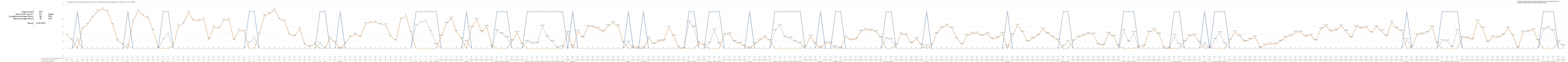
| Category | 1 = Strom reicht im Tagesdurchschnitt aus | Zusätzlich benötigter Strom | Überschüssiger Strom |
|---|---|---|---|
| 0 | 0 | 0.36 | 0 |
| 1 | 0 | 0.23 | 0 |
| 2 | 1 | 0 | 0.25 |
| 3 | 0 | 0.54 | 0 |
| 4 | 0 | 0.66 | 0 |
| 5 | 0 | 0.85 | 0 |
| 6 | 0 | 1.02 | 0 |
| 7 | 0 | 1.07 | 0 |
| 8 | 0 | 1.01 | 0 |
| 9 | 0 | 0.65 | 0 |
| 10 | 0 | 0.21 | 0 |
| 11 | 0 | 0.12 | 0 |
| 12 | 1 | 0 | 0.09 |
| 13 | 0 | 0.73 | 0 |
| 14 | 0 | 1.02 | 0 |
| 15 | 0 | 0.9 | 0 |
| 16 | 0 | 0.83 | 0 |
| 17 | 0 | 0.49 | 0 |
| 18 | 0 | 0.02 | 0 |
| 19 | 1 | 0 | 0.25 |
| 20 | 1 | 0 | 0.4 |
| 21 | 0 | 0.1 | 0 |
| 22 | 0 | 0.61 | 0 |
| 23 | 0 | 0.69 | 0 |
| 24 | 0 | 0.98 | 0 |
| 25 | 0 | 0.76 | 0 |
| 26 | 0 | 0.76 | 0 |
| 27 | 0 | 0.8 | 0 |
| 28 | 0 | 0.25 | 0 |
| 29 | 0 | 0.58 | 0 |
| 30 | 0 | 0.55 | 0 |
| 31 | 0 | 0.77 | 0 |
| 32 | 0 | 0.79 | 0 |
| 33 | 0 | 0.23 | 0 |
| 34 | 0 | 0.5 | 0 |
| 35 | 0 | 0.47 | 0 |
| 36 | 1 | 0 | 0.16 |
| 37 | 1 | 0 | 0.3 |
| 38 | 0 | 0.39 | 0 |
| 39 | 0 | 0.89 | 0 |
| 40 | 0 | 0.95 | 0 |
| 41 | 0 | 1.05 | 0 |
| 42 | 0 | 0.8 | 0 |
| 43 | 0 | 0.74 | 0 |
| 44 | 0 | 0.37 | 0 |
| 45 | 0 | 0.34 | 0 |
| 46 | 0 | 0.54 | 0 |
| 47 | 0 | 0.11 | 0 |
| 48 | 0 | 0.06 | 0 |
| 49 | 0 | 0.13 | 0 |
| 50 | 1 | 0 | 0.14 |
| 51 | 1 | 0 | 0.01 |
| 52 | 0 | 0.29 | 0 |
| 53 | 0 | 0.16 | 0 |
| 54 | 1 | 0 | 0 |
| 55 | 0 | 0.14 | 0 |
| 56 | 0 | 0.32 | 0 |
| 57 | 0 | 0.39 | 0 |
| 58 | 0 | 0.32 | 0 |
| 59 | 0 | 0.68 | 0 |
| 60 | 0 | 0.71 | 0 |
| 61 | 0 | 0.72 | 0 |
| 62 | 0 | 0.66 | 0 |
| 63 | 0 | 0.65 | 0 |
| 64 | 0 | 0.33 | 0 |
| 65 | 0 | 0.22 | 0 |
| 66 | 0 | 0.8 | 0 |
| 67 | 0 | 0.9 | 0 |
| 68 | 0 | 0.43 | 0 |
| 69 | 1 | 0 | 0.63 |
| 70 | 1 | 0 | 0.71 |
| 71 | 1 | 0 | 0.75 |
| 72 | 1 | 0 | 0.46 |
| 73 | 1 | 0 | 0.11 |
| 74 | 0 | 0.335 | 0 |
| 75 | 0 | 0.683 | 0 |
| 76 | 0 | 0.822 | 0 |
| 77 | 0 | 0.459 | 0 |
| 78 | 0 | 0.265 | 0 |
| 79 | 1 | 0 | 0.195 |
| 80 | 0 | 0.568 | 0 |
| 81 | 0 | 0.78 | 0 |
| 82 | 0 | 0.454 | 0 |
| 83 | 0 | 0.6 | 0 |
| 84 | 0 | 0.055 | 0 |
| 85 | 1 | 0 | 0.484 |
| 86 | 1 | 0 | 0.402 |
| 87 | 1 | 0 | 0.297 |
| 88 | 0 | 0.206 | 0 |
| 89 | 0 | 0.437 | 0 |
| 90 | 0 | 0.115 | 0 |
| 91 | 1 | 0 | 0.189 |
| 92 | 1 | 0 | 0.142 |
| 93 | 1 | 0 | 0.144 |
| 94 | 1 | 0 | 0.606 |
| 95 | 1 | 0 | 0.315 |
| 96 | 1 | 0 | 0.189 |
| 97 | 1 | 0 | 0.021 |
| 98 | 1 | 0 | 0.059 |
| 99 | 0 | 0.428 | 0 |
| 100 | 1 | 0 | 0.063 |
| 101 | 0 | 0.473 | 0 |
| 102 | 0 | 0.298 | 0 |
| 103 | 0 | 0.597 | 0 |
| 104 | 0 | 0.587 | 0 |
| 105 | 0 | 0.546 | 0 |
| 106 | 0 | 0.465 | 0 |
| 107 | 0 | 0.616 | 0 |
| 108 | 0 | 0.701 | 0 |
| 109 | 0 | 0.61 | 0 |
| 110 | 0 | 0.166 | 0 |
| 111 | 1 | 0 | 0.17 |
| 112 | 0 | 0.034 | 0 |
| 113 | 0 | 0.014 | 0 |
| 114 | 1 | 0 | 0.016 |
| 115 | 0 | 0.277 | 0 |
| 116 | 0 | 0.123 | 0 |
| 117 | 0 | 0.2 | 0 |
| 118 | 0 | 0.21 | 0 |
| 119 | 0 | 0.573 | 0 |
| 120 | 0 | 0.335 | 0 |
| 121 | 0 | 0.028 | 0 |
| 122 | 0 | 0.003 | 0 |
| 123 | 1 | 0 | 0.71 |
| 124 | 1 | 0 | 0.582 |
| 125 | 0 | 0.155 | 0 |
| 126 | 0 | 0.092 | 0 |
| 127 | 1 | 0 | 0.142 |
| 128 | 1 | 0 | 0.5 |
| 129 | 1 | 0 | 0.131 |
| 130 | 0 | 0.379 | 0 |
| 131 | 0 | 0.395 | 0 |
| 132 | 0 | 0.188 | 0 |
| 133 | 0 | 0.143 | 0 |
| 134 | 0 | 0.064 | 0 |
| 135 | 1 | 0 | 0.021 |
| 136 | 0 | 0.129 | 0 |
| 137 | 0 | 0.236 | 0 |
| 138 | 0 | 0.309 | 0 |
| 139 | 0 | 0.217 | 0 |
| 140 | 1 | 0 | 0.482 |
| 141 | 1 | 0 | 0.617 |
| 142 | 1 | 0 | 0.307 |
| 143 | 1 | 0 | 0.283 |
| 144 | 1 | 0 | 0.189 |
| 145 | 1 | 0 | 0.138 |
| 146 | 0 | 0.052 | 0 |
| 147 | 0 | 0.329 | 0 |
| 148 | 0 | 0.128 | 0 |
| 149 | 1 | 0 | 0.035 |
| 150 | 0 | 0.156 | 0 |
| 151 | 0 | 0.146 | 0 |
| 152 | 1 | 0 | 0.05 |
| 153 | 1 | 0 | 0.014 |
| 154 | 0 | 0.307 | 0 |
| 155 | 0 | 0.234 | 0 |
| 156 | 0 | 0.255 | 0 |
| 157 | 0 | 0.469 | 0 |
| 158 | 0 | 0.512 | 0 |
| 159 | 0 | 0.495 | 0 |
| 160 | 0 | 0.461 | 0 |
| 161 | 0 | 0.3 | 0 |
| 162 | 1 | 0 | 0.274 |
| 163 | 1 | 0 | 0.243 |
| 164 | 0 | 0.101 | 0 |
| 165 | 0 | 0.393 | 0 |
| 166 | 0 | 0.369 | 0 |
| 167 | 0 | 0.144 | 0 |
| 168 | 0 | 0.27 | 0 |
| 169 | 0 | 0.095 | 0 |
| 170 | 1 | 0 | 0.077 |
| 171 | 0 | 0.095 | 0 |
| 172 | 0 | 0.406 | 0 |
| 173 | 0 | 0.563 | 0 |
| 174 | 0 | 0.63 | 0 |
| 175 | 0 | 0.556 | 0 |
| 176 | 0 | 0.273 | 0 |
| 177 | 0 | 0.11 | 0 |
| 178 | 0 | 0.355 | 0 |
| 179 | 0 | 0.403 | 0 |
| 180 | 0 | 0.415 | 0 |
| 181 | 0 | 0.351 | 0 |
| 182 | 0 | 0.399 | 0 |
| 183 | 0 | 0.258 | 0 |
| 184 | 0 | 0.293 | 0 |
| 185 | 0 | 0.408 | 0 |
| 186 | 1 | 0 | 0.065 |
| 187 | 0 | 0.367 | 0 |
| 188 | 0 | 0.629 | 0 |
| 189 | 0 | 0.448 | 0 |
| 190 | 0 | 0.191 | 0 |
| 191 | 0 | 0.281 | 0 |
| 192 | 0 | 0.35 | 0 |
| 193 | 0 | 0.528 | 0 |
| 194 | 0 | 0.402 | 0 |
| 195 | 0 | 0.31 | 0 |
| 196 | 0 | 0.235 | 0 |
| 197 | 1 | 0 | 0.063 |
| 198 | 1 | 0 | 0.187 |
| 199 | 0 | 0.206 | 0 |
| 200 | 0 | 0.309 | 0 |
| 201 | 0 | 0.354 | 0 |
| 202 | 0 | 0.404 | 0 |
| 203 | 0 | 0.388 | 0 |
| 204 | 0 | 0.11 | 0 |
| 205 | 0 | 0.093 | 0 |
| 206 | 0 | 0.41 | 0 |
| 207 | 0 | 0.329 | 0 |
| 208 | 0 | 0.066 | 0 |
| 209 | 1 | 0 | 0.493 |
| 210 | 1 | 0 | 0.182 |
| 211 | 1 | 0 | 0.433 |
| 212 | 0 | 0.042 | 0 |
| 213 | 0 | 0.071 | 0 |
| 214 | 0 | 0.441 | 0 |
| 215 | 0 | 0.51 | 0 |
| 216 | 0 | 0.389 | 0 |
| 217 | 0 | 0.012 | 0 |
| 218 | 0 | 0.011 | 0 |
| 219 | 1 | 0 | 0.358 |
| 220 | 1 | 0 | 0.112 |
| 221 | 0 | 0.184 | 0 |
| 222 | 0 | 0.34 | 0 |
| 223 | 0 | 0.36 | 0 |
| 224 | 0 | 0.168 | 0 |
| 225 | 1 | 0 | 0.116 |
| 226 | 0 | 0.036 | 0 |
| 227 | 1 | 0 | 0.242 |
| 228 | 1 | 0 | 0.43 |
| 229 | 1 | 0 | 0.129 |
| 230 | 0 | 0.223 | 0 |
| 231 | 0 | 0.451 | 0 |
| 232 | 0 | 0.331 | 0 |
| 233 | 0 | 0.194 | 0 |
| 234 | 0 | 0.249 | 0 |
| 235 | 0 | 0.314 | 0 |
| 236 | 0 | 0.019 | 0 |
| 237 | 0 | 0.095 | 0 |
| 238 | 0 | 0.122 | 0 |
| 239 | 0 | 0.118 | 0 |
| 240 | 0 | 0.198 | 0 |
| 241 | 0 | 0.302 | 0 |
| 242 | 0 | 0.341 | 0 |
| 243 | 0 | 0.444 | 0 |
| 244 | 0 | 0.445 | 0 |
| 245 | 0 | 0.329 | 0 |
| 246 | 0 | 0.361 | 0 |
| 247 | 0 | 0.216 | 0 |
| 248 | 0 | 0.534 | 0 |
| 249 | 0 | 0.615 | 0 |
| 250 | 0 | 0.472 | 0 |
| 251 | 0 | 0.495 | 0 |
| 252 | 0 | 0.613 | 0 |
| 253 | 0 | 0.47 | 0 |
| 254 | 0 | 0.296 | 0 |
| 255 | 0 | 0.6 | 0 |
| 256 | 0 | 0.55 | 0 |
| 257 | 0 | 0.576 | 0 |
| 258 | 0 | 0.432 | 0 |
| 259 | 0 | 0.59 | 0 |
| 260 | 0 | 0.477 | 0 |
| 261 | 0 | 0.331 | 0 |
| 262 | 0 | 0.714 | 0 |
| 263 | 0 | 0.548 | 0 |
| 264 | 0 | 0.476 | 0 |
| 265 | 1 | 0 | 0.242 |
| 266 | 0 | 0.041 | 0 |
| 267 | 0 | 0.369 | 0 |
| 268 | 0 | 0.396 | 0 |
| 269 | 0 | 0.43 | 0 |
| 270 | 0 | 0.579 | 0 |
| 271 | 0 | 0.143 | 0 |
| 272 | 1 | 0 | 0.215 |
| 273 | 1 | 0 | 0.205 |
| 274 | 1 | 0 | 0.042 |
| 275 | 1 | 0 | 0.487 |
| 276 | 0 | 0.297 | 0 |
| 277 | 0 | 0.287 | 0 |
| 278 | 0 | 0.249 | 0 |
| 279 | 0 | 0.736 | 0 |
| 280 | 0 | 0.554 | 0 |
| 281 | 0 | 0.174 | 0 |
| 282 | 0 | 0.313 | 0 |
| 283 | 0 | 0.303 | 0 |
| 284 | 0 | 0.365 | 0 |
| 285 | 0 | 0.552 | 0 |
| 286 | 0 | 0.346 | 0 |
| 287 | 0 | 0.022 | 0 |
| 288 | 0 | 0.449 | 0 |
| 289 | 0 | 0.462 | 0 |
| 290 | 0 | 0.506 | 0 |
| 291 | 0 | 0.219 | 0 |
| 292 | 1 | 0 | 0.525 |
| 293 | 1 | 0 | 0.56 |
| 294 | 1 | 0 | 0.482 |
| 295 | 0 | 0.183 | 0 |
| 296 | 0 | 0.07 | 0 |